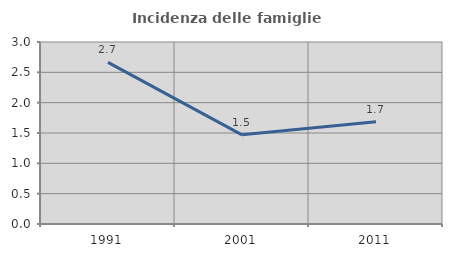
| Category | Incidenza delle famiglie numerose |
|---|---|
| 1991.0 | 2.665 |
| 2001.0 | 1.47 |
| 2011.0 | 1.686 |